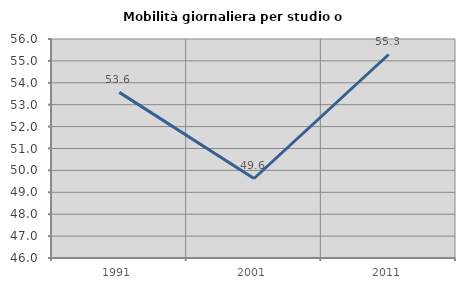
| Category | Mobilità giornaliera per studio o lavoro |
|---|---|
| 1991.0 | 53.563 |
| 2001.0 | 49.631 |
| 2011.0 | 55.292 |